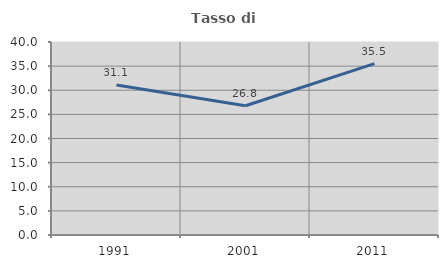
| Category | Tasso di occupazione   |
|---|---|
| 1991.0 | 31.092 |
| 2001.0 | 26.796 |
| 2011.0 | 35.53 |